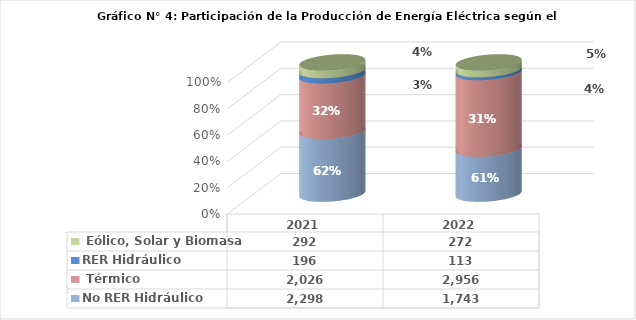
| Category | No RER Hidráulico | No RER Térmico | RER Hidráulico | RER Eólico, Solar y Biomasa |
|---|---|---|---|---|
| 2021.0 | 2298.168 | 2026.462 | 196.462 | 291.651 |
| 2022.0 | 1742.92 | 2956.37 | 113.49 | 271.788 |